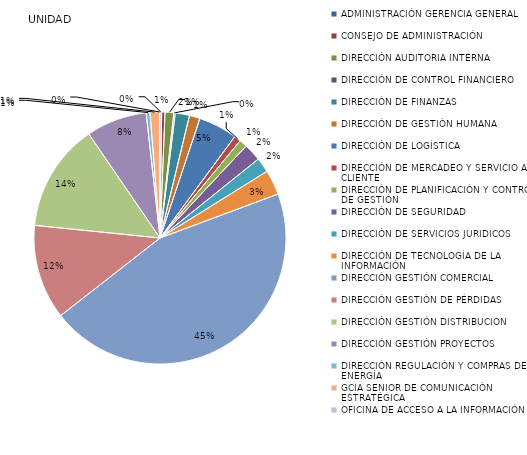
| Category | Series 0 |
|---|---|
| ADMINISTRACIÓN GERENCIA GENERAL | 6 |
| CONSEJO DE ADMINISTRACIÓN | 12 |
| DIRECCIÓN AUDITORIA INTERNA | 32 |
| DIRECCIÓN DE CONTROL FINANCIERO | 5 |
| DIRECCIÓN DE FINANZAS | 52 |
| DIRECCIÓN DE GESTIÓN HUMANA | 39 |
| DIRECCIÓN DE LOGÍSTICA | 142 |
| DIRECCIÓN DE MERCADEO Y SERVICIO AL CLIENTE | 24 |
| DIRECCIÓN DE PLANIFICACIÓN Y CONTROL DE GESTIÓN | 29 |
| DIRECCIÓN DE SEGURIDAD | 64 |
| DIRECCIÓN DE SERVICIOS JURIDICOS | 54 |
| DIRECCIÓN DE TECNOLOGÍA DE LA INFORMACIÓN | 91 |
| DIRECCIÓN GESTIÓN COMERCIAL | 1284 |
| DIRECCIÓN GESTIÓN DE PÉRDIDAS | 346 |
| DIRECCIÓN GESTIÓN DISTRIBUCION | 394 |
| DIRECCIÓN GESTIÓN PROYECTOS | 222 |
| DIRECCIÓN REGULACIÓN Y COMPRAS DE ENERGÍA | 14 |
| GCIA SENIOR DE COMUNICACIÓN ESTRATÉGICA | 34 |
| OFICINA DE ACCESO A LA INFORMACIÓN | 2 |